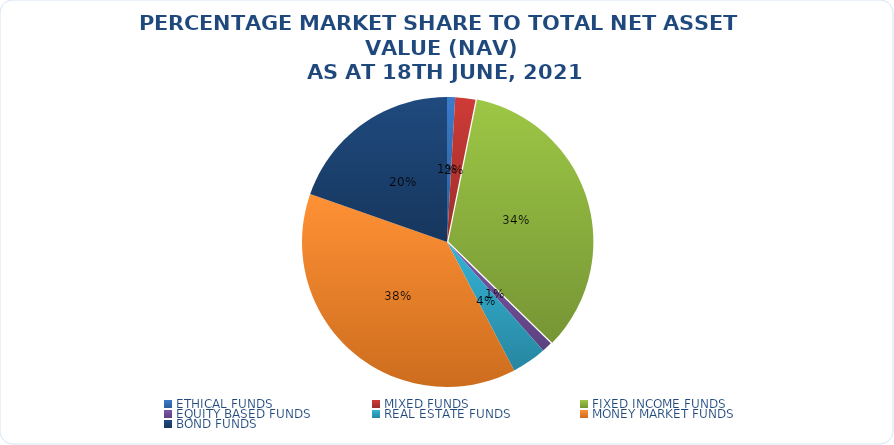
| Category | NET ASSET VALUE |
|---|---|
| ETHICAL FUNDS | 11631992386.926 |
| MIXED FUNDS | 29034018551.8 |
| FIXED INCOME FUNDS | 439618097870.117 |
| EQUITY BASED FUNDS | 15010766217.84 |
| REAL ESTATE FUNDS | 49767162113.861 |
| MONEY MARKET FUNDS | 489812631106.657 |
| BOND FUNDS | 252726985618.4 |